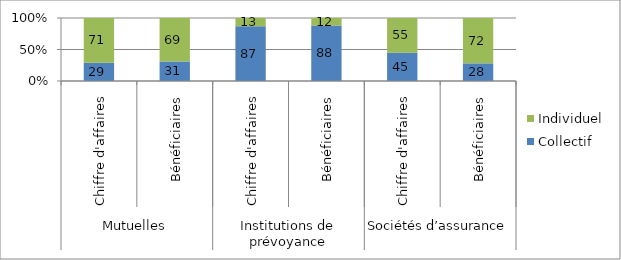
| Category | Collectif | Individuel |
|---|---|---|
| 0 | 29 | 71 |
| 1 | 31 | 69 |
| 2 | 87 | 13 |
| 3 | 88 | 12 |
| 4 | 45 | 55 |
| 5 | 28 | 72 |